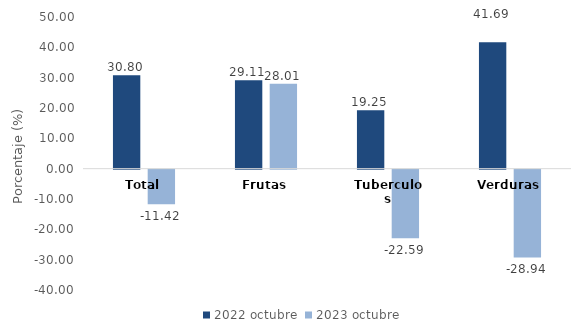
| Category | 2022 | 2023 |
|---|---|---|
| Total | 30.804 | -11.421 |
| Frutas | 29.111 | 28.01 |
| Tuberculos | 19.254 | -22.588 |
| Verduras | 41.69 | -28.935 |